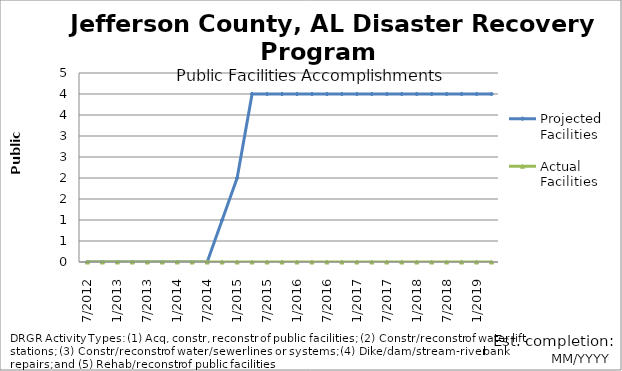
| Category | Projected Facilities | Actual Facilities |
|---|---|---|
| 7/2012 | 0 | 0 |
| 10/2012 | 0 | 0 |
| 1/2013 | 0 | 0 |
| 4/2013 | 0 | 0 |
| 7/2013 | 0 | 0 |
| 10/2013 | 0 | 0 |
| 1/2014 | 0 | 0 |
| 4/2014 | 0 | 0 |
| 7/2014 | 0 | 0 |
| 10/2014 | 1 | 0 |
| 1/2015 | 2 | 0 |
| 4/2015 | 4 | 0 |
| 7/2015 | 4 | 0 |
| 10/2015 | 4 | 0 |
| 1/2016 | 4 | 0 |
| 4/2016 | 4 | 0 |
| 7/2016 | 4 | 0 |
| 10/2016 | 4 | 0 |
| 1/2017 | 4 | 0 |
| 4/2017 | 4 | 0 |
| 7/2017 | 4 | 0 |
| 10/2017 | 4 | 0 |
| 1/2018 | 4 | 0 |
| 4/2018 | 4 | 0 |
| 7/2018 | 4 | 0 |
| 10/2018 | 4 | 0 |
| 1/2019 | 4 | 0 |
| 4/2019 | 4 | 0 |